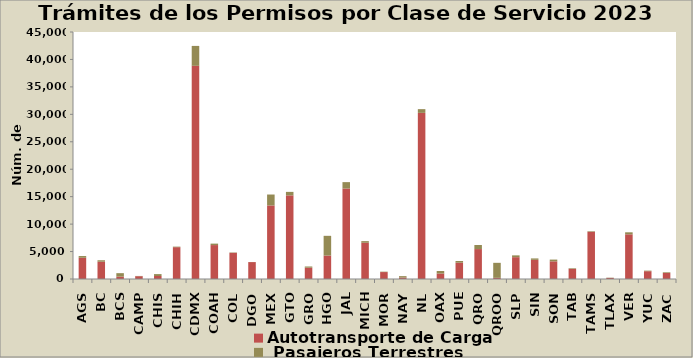
| Category | Autotransporte de Carga  |  Pasajeros Terrestres |
|---|---|---|
| AGS | 3869 | 316 |
| BC | 3147 | 268 |
| BCS | 432 | 632 |
| CAMP | 508 | 47 |
| CHIS | 551 | 341 |
| CHIH | 5799 | 97 |
| CDMX | 38839 | 3627 |
| COAH | 6182 | 264 |
| COL | 4764 | 69 |
| DGO | 3082 | 19 |
| MEX | 13401 | 1990 |
| GTO | 15240 | 632 |
| GRO | 2061 | 218 |
| HGO | 4272 | 3594 |
| JAL | 16486 | 1163 |
| MICH | 6600 | 299 |
| MOR | 1264 | 71 |
| NAY | 260 | 262 |
| NL | 30263 | 682 |
| OAX | 996 | 458 |
| PUE | 2974 | 311 |
| QRO | 5453 | 739 |
| QROO | 211 | 2736 |
| SLP | 3978 | 328 |
| SIN | 3487 | 260 |
| SON | 3217 | 320 |
| TAB | 1860 | 101 |
| TAMS | 8602 | 102 |
| TLAX | 196 | 45 |
| VER | 8141 | 368 |
| YUC | 1421 | 104 |
| ZAC | 1095 | 124 |